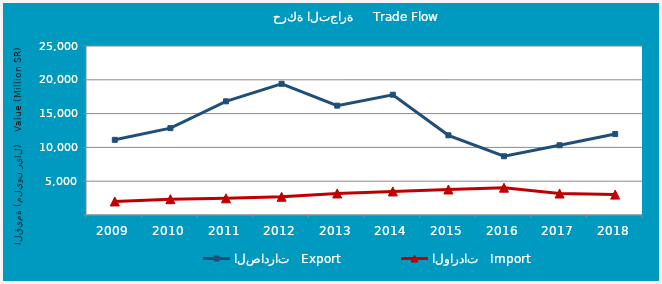
| Category | الصادرات   Export | الواردات   Import |
|---|---|---|
| 2009.0 | 11120570240 | 2004493040 |
| 2010.0 | 12848719030 | 2341595378 |
| 2011.0 | 16816413996 | 2465969444 |
| 2012.0 | 19404158857 | 2697430216 |
| 2013.0 | 16178241454 | 3187606587 |
| 2014.0 | 17792327390 | 3486963024 |
| 2015.0 | 11788674070 | 3772547712 |
| 2016.0 | 8690750821 | 4041584138 |
| 2017.0 | 10317939373 | 3176491906 |
| 2018.0 | 11976694599 | 3018632735 |